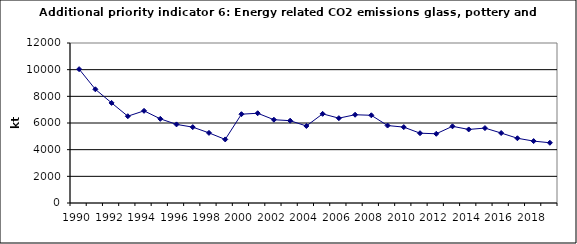
| Category | Energy related CO2 emissions from glass, pottery and building materials, kt |
|---|---|
| 1990 | 10038.445 |
| 1991 | 8528.305 |
| 1992 | 7506.565 |
| 1993 | 6509.703 |
| 1994 | 6912.553 |
| 1995 | 6313.493 |
| 1996 | 5895.583 |
| 1997 | 5690.179 |
| 1998 | 5258.27 |
| 1999 | 4768.122 |
| 2000 | 6660.288 |
| 2001 | 6732.338 |
| 2002 | 6247.198 |
| 2003 | 6173.363 |
| 2004 | 5776.241 |
| 2005 | 6686.141 |
| 2006 | 6362.72 |
| 2007 | 6619.057 |
| 2008 | 6578.183 |
| 2009 | 5810.025 |
| 2010 | 5691.42 |
| 2011 | 5235.224 |
| 2012 | 5192.55 |
| 2013 | 5751.671 |
| 2014 | 5516.665 |
| 2015 | 5618.451 |
| 2016 | 5248.012 |
| 2017 | 4855.113 |
| 2018 | 4642.916 |
| 2019 | 4516.542 |